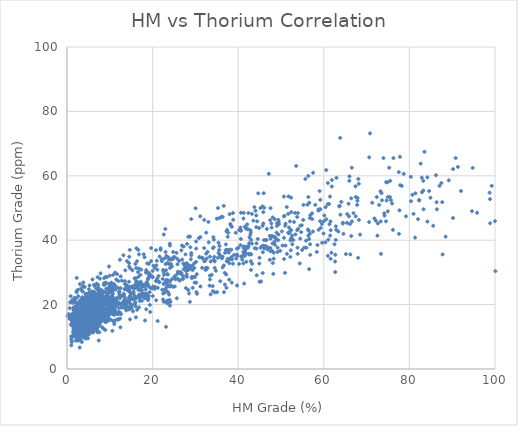
| Category | Series 0 |
|---|---|
| 5.443047224 | 18.534 |
| 2.898147194 | 12.831 |
| 1.411529032 | 17.108 |
| 7.118693742 | 17.108 |
| 9.540768168 | 24.95 |
| 59.60143324 | 39.207 |
| 44.99017923 | 27.088 |
| 17.22734157 | 27.088 |
| nan | 29.94 |
| nan | 34.93 |
| 1.644251991 | 21.386 |
| 5.271050762 | 20.673 |
| 2.274062136 | 24.237 |
| 21.63733876 | 34.93 |
| 41.54231609 | 44.197 |
| 3.07612922 | 17.108 |
| 15.50318212 | 25.663 |
| 9.811186497 | 26.376 |
| 46.68665275 | 43.484 |
| 3.796539203 | 17.108 |
| 4.842013208 | 20.531 |
| 36.05757259 | 47.221 |
| 51.06817726 | 38.324 |
| 40.94105243 | 34.903 |
| 4.273843238 | 17.109 |
| 4.148194291 | 17.109 |
| 63.88212248 | 47.906 |
| 1.247108864 | 15.683 |
| 0.534299388 | 15.683 |
| 18.01900011 | 25.663 |
| 30.80949927 | 40.633 |
| nan | 47.761 |
| 41.28483305 | 48.474 |
| 32.82107337 | 31.366 |
| 8.660848991 | 17.108 |
| 38.83294263 | 46.336 |
| 3.324656386 | 9.98 |
| 1.871702953 | 19.247 |
| nan | 52.751 |
| nan | 33.504 |
| 3.547087353 | 19.247 |
| 2.218481889 | 15.683 |
| 1.515212356 | 14.257 |
| 7.060243335 | 12.119 |
| 11.2421479 | 29.94 |
| nan | 37.781 |
| 24.81294867 | 36.356 |
| 42.09048786 | 44.91 |
| 35.40345185 | 39.207 |
| 6.826329512 | 24.95 |
| 3.224686492 | 24.95 |
| 3.002171558 | 16.396 |
| 3.489379962 | 19.247 |
| 5.22696755 | 19.96 |
| 5.967452877 | 23.524 |
| 6.566618421 | 19.247 |
| nan | 37.068 |
| nan | 39.92 |
| 23.0244987 | 36.356 |
| 14.49130811 | 27.088 |
| 9.339041697 | 28.514 |
| 4.513258618 | 18.534 |
| 5.718179758 | 13.687 |
| 5.739538427 | 14.372 |
| 6.737158139 | 19.162 |
| 8.713448789 | 26.69 |
| 10.58965724 | 24.637 |
| 15.96841779 | 28.059 |
| 9.531069121 | 23.268 |
| 16.58429999 | 30.112 |
| 7.694521282 | 18.478 |
| 4.832027876 | 19.847 |
| 3.648580805 | 14.372 |
| 14.55380195 | 24.637 |
| 10.90348627 | 20.716 |
| 22.46570435 | 30.76 |
| 5.190229579 | 21.971 |
| 13.53195368 | 26.366 |
| 30.14882092 | 33.271 |
| 57.25847846 | 48.337 |
| 34.32783716 | 40.176 |
| 66.57595837 | 45.826 |
| 68.01805269 | 34.526 |
| 2.254602295 | 23.855 |
| 4.752360783 | 20.716 |
| 3.020128774 | 26.366 |
| 5.500807244 | 21.971 |
| 22.57625526 | 30.132 |
| 65.47347866 | 48.106 |
| 2.218819858 | 17.269 |
| 3.206383645 | 19.736 |
| 22.46995645 | 23.436 |
| nan | 42.555 |
| 62.79817115 | 40.088 |
| 47.48591204 | 37.621 |
| 89.20198834 | 58.591 |
| 52.41935705 | 48.723 |
| nan | 49.956 |
| 47.5454376 | 49.956 |
| 26.04125321 | 27.754 |
| 4.934615617 | 16.035 |
| 4.293739836 | 16.652 |
| 4.157938086 | 16.652 |
| 2.518863823 | 15.419 |
| 3.870010558 | 19.736 |
| nan | 14.265 |
| 2.213968285 | 12.125 |
| 2.644966465 | 18.544 |
| 3.529642335 | 19.257 |
| nan | 15.691 |
| 4.316635014 | 20.684 |
| 4.401479136 | 17.118 |
| 6.994553412 | 22.823 |
| 3.949466186 | 19.97 |
| 2.586025973 | 15.691 |
| 3.130321805 | 19.97 |
| 3.073301532 | 14.265 |
| 10.77252649 | 29.242 |
| 11.50014101 | 20.684 |
| 2.04686753 | 17.118 |
| 4.378042938 | 13.551 |
| 4.225699195 | 14.265 |
| 4.124676839 | 9.985 |
| 11.41055365 | 25.676 |
| 10.57167759 | 24.25 |
| 11.67603989 | 22.11 |
| 8.324439788 | 19.257 |
| 9.48560322 | 19.97 |
| 7.40520238 | 23.537 |
| 15.28689974 | 30.669 |
| 58.74040314 | 49.187 |
| 2.118936697 | 12.791 |
| 3.772650814 | 10.098 |
| 3.631922108 | 12.791 |
| 4.388957782 | 10.098 |
| 5.963945758 | 27.801 |
| 11.50661699 | 27.801 |
| 22.97577546 | 43.484 |
| 19.99346534 | 28.514 |
| 3.604970711 | 14.438 |
| 2.512168511 | 18.833 |
| 3.078537477 | 16.949 |
| 7.265708773 | 24.482 |
| 9.948949689 | 25.738 |
| nan | 48.337 |
| 56.83499343 | 47.709 |
| nan | 37.621 |
| 60.93639638 | 57.753 |
| 2.636572952 | 22.599 |
| 3.928756567 | 21.344 |
| 1.63217215 | 15.694 |
| 56.38469391 | 41.432 |
| 0.747194042 | 20.716 |
| 61.32249476 | 44.964 |
| 49.21569586 | 37.69 |
| 67.86079263 | 52.238 |
| 9.051094224 | 16.69 |
| 6.600237668 | 17.882 |
| nan | 33.379 |
| 53.88841781 | 35.764 |
| 30.1952064 | 26.823 |
| 24.09634954 | 25.631 |
| 19.96377227 | 25.034 |
| 23.10817276 | 20.862 |
| 24.17308071 | 20.862 |
| 2.470060139 | 10.729 |
| nan | 47.906 |
| 74.53040548 | 45.852 |
| 66.20413908 | 35.587 |
| 23.27898553 | 27.375 |
| nan | 45.168 |
| 52.09785037 | 45.852 |
| 18.47192576 | 22.054 |
| 10.36526639 | 17.286 |
| 15.8432607 | 20.266 |
| 25.19030992 | 25.631 |
| 27.13030777 | 28.015 |
| 15.42360446 | 17.882 |
| 14.54328252 | 18.478 |
| 29.82374204 | 26.823 |
| 9.209258744 | 17.192 |
| 10.75279903 | 25.127 |
| 31.72742031 | 34.384 |
| 42.54810327 | 35.707 |
| 5.359891562 | 23.804 |
| 55.20536267 | 46.286 |
| 44.90184872 | 43.773 |
| 8.587962292 | 18.571 |
| 2.657645197 | 17.577 |
| nan | 14.438 |
| 4.564191864 | 22.55 |
| nan | 40.772 |
| 49.05071186 | 44.437 |
| 40.53475224 | 38.467 |
| nan | 12.964 |
| 19.19581993 | 29.182 |
| nan | 13.646 |
| 6.541386533 | 18.571 |
| 7.732274182 | 23.876 |
| 11.38806811 | 17.244 |
| 37.67633772 | 42.319 |
| 44.27931575 | 39.013 |
| 86.20926226 | 60.172 |
| 32.83456802 | 36.368 |
| 27.76248162 | 25.127 |
| 17.47696483 | 21.16 |
| 35.0760916 | 23.855 |
| 46.94409682 | 37.665 |
| 9.558607248 | 22.599 |
| 8.7383345 | 17.577 |
| 18.07907641 | 21.971 |
| 42.99311538 | 30.76 |
| 24.06681225 | 31.388 |
| 25.76236319 | 29.504 |
| 51.86201668 | 43.943 |
| 2.626646785 | 13.811 |
| 9.971381773 | 23.855 |
| 86.42811251 | 49.593 |
| 44.31840022 | 29.094 |
| 44.98402703 | 34.526 |
| 6.974977177 | 14.438 |
| 7.286500008 | 13.811 |
| 10.52144731 | 18.205 |
| 6.892345011 | 16.949 |
| 18.95973983 | 21.344 |
| nan | 45.826 |
| 74.96298919 | 48.965 |
| 68.07915688 | 59.009 |
| nan | 35.771 |
| 7.304337797 | 17.577 |
| 15.11880843 | 18.833 |
| 53.86610557 | 37.665 |
| 7.209928576 | 16.309 |
| 7.861495006 | 19.706 |
| 9.744009094 | 24.463 |
| 9.925930224 | 17.668 |
| 67.78977035 | 50.965 |
| 11.22818339 | 18.347 |
| 33.79677817 | 29.22 |
| 82.26876285 | 52.324 |
| 66.39929259 | 53.003 |
| 15.97056225 | 32.617 |
| 16.74082201 | 22.482 |
| nan | 39.013 |
| 56.50153504 | 42.98 |
| 48.97277126 | 42.319 |
| 87.03867004 | 56.866 |
| 18.66427166 | 22.599 |
| 5.617350973 | 16.949 |
| 34.24043232 | 33.899 |
| 40.20486584 | 32.643 |
| 47.74963251 | 45.198 |
| 73.47016842 | 54.614 |
| 37.91574965 | 37.037 |
| 10.41199608 | 23.855 |
| 12.04817835 | 25.11 |
| 12.35118418 | 17.577 |
| 8.684814673 | 18.833 |
| 12.08018341 | 20.088 |
| 7.378509952 | 24.482 |
| 16.02268744 | 19.46 |
| 11.13641601 | 18.205 |
| 10.88113663 | 20.088 |
| 41.54608048 | 35.154 |
| 31.57726296 | 34.526 |
| 35.20987797 | 34.526 |
| 9.660513342 | 20.716 |
| nan | 19.119 |
| 7.552936592 | 17.577 |
| 63.39598303 | 42.687 |
| 61.04256728 | 40.176 |
| 12.32168769 | 21.971 |
| 18.28006195 | 22.599 |
| 20.82940643 | 21.344 |
| 80.37901522 | 52.103 |
| 56.2939619 | 43.315 |
| 38.39457073 | 37.037 |
| 13.84091747 | 18.205 |
| 1.907687032 | 18.205 |
| 74.12546706 | 48.337 |
| 78.22101385 | 56.866 |
| 62.81224472 | 44.303 |
| 70.58788687 | 45.625 |
| 4.301753664 | 18.205 |
| 18.62849839 | 26.993 |
| 61.57323972 | 45.826 |
| 5.951750033 | 16.322 |
| 12.5091618 | 25.11 |
| 3.741001253 | 25.738 |
| 1.974556852 | 19.46 |
| 6.756083648 | 20.716 |
| nan | 42.059 |
| 4.499095777 | 18.205 |
| 6.126155509 | 18.833 |
| 6.444062344 | 25.738 |
| nan | 28.987 |
| 16.68815277 | 22.517 |
| 12.39667582 | 15.693 |
| 10.91288187 | 24.564 |
| 9.003299683 | 21.834 |
| nan | 28.658 |
| nan | 29.34 |
| 17.13856213 | 24.564 |
| 29.68964647 | 32.751 |
| 49.46514771 | 45.716 |
| 48.05673723 | 47.08 |
| 19.32332798 | 23.881 |
| 5.013634518 | 21.834 |
| 23.11579066 | 27.532 |
| 32.55499102 | 30.89 |
| 6.435999361 | 23.503 |
| 5.778260539 | 18.131 |
| 12.16791576 | 20.47 |
| 11.06462425 | 19.105 |
| 20.90135801 | 27.293 |
| 4.611386676 | 10.917 |
| nan | 36.163 |
| nan | 27.975 |
| 34.50639648 | 31.387 |
| 76.27767337 | 65.503 |
| 59.18199166 | 52.539 |
| 39.43710782 | 42.304 |
| 7.180746762 | 12.964 |
| 8.686496456 | 21.834 |
| 7.371761844 | 19.787 |
| 62.96263052 | 59.362 |
| 8.289859115 | 17.74 |
| 6.620193159 | 17.058 |
| 4.028450133 | 10.917 |
| 2.81804257 | 14.329 |
| 17.31041372 | 23.199 |
| 27.98718348 | 29.34 |
| 90.21245952 | 62.091 |
| 37.19387102 | 29.34 |
| 11.18525513 | 19.787 |
| 15.18725936 | 19.787 |
| 13.74310011 | 20.47 |
| 37.79659225 | 36.163 |
| 26.68893193 | 29.803 |
| 100.0955489 | 30.399 |
| 4.140632706 | 14.901 |
| 4.933060368 | 13.113 |
| 7.818472265 | 15.498 |
| 10.49273586 | 17.286 |
| 40.94900185 | 33.975 |
| 36.89243657 | 26.227 |
| nan | 36.956 |
| 6.908536012 | 16.69 |
| 11.28271998 | 20.47 |
| 9.166077094 | 22.517 |
| 13.52230075 | 27.293 |
| nan | 35.764 |
| 14.66590336 | 22.517 |
| 3.349285406 | 13.687 |
| 7.061397423 | 15.74 |
| 54.9385708 | 36.956 |
| 5.740323159 | 13.003 |
| 40.60835697 | 43.115 |
| 4.009649318 | 13.687 |
| 125.1375857 | 33.534 |
| 37.54079611 | 41.062 |
| 9.410763915 | 19.162 |
| 8.349390417 | 16.69 |
| 7.58763618 | 14.901 |
| 20.87598484 | 32.187 |
| nan | 28.611 |
| nan | 28.658 |
| 17.50739399 | 24.438 |
| 82.63559169 | 63.778 |
| 99.99320538 | 45.897 |
| 25.85898365 | 28.015 |
| 4.744737868 | 16.69 |
| 3.497412241 | 11.921 |
| 60.37629177 | 39.34 |
| 4.744240358 | 10.729 |
| 94.78291522 | 62.451 |
| 25.88634092 | 30.218 |
| 41.79253174 | 43.649 |
| 24.77804064 | 25.518 |
| nan | 71.181 |
| 94.61868344 | 49.021 |
| 73.6044792 | 52.378 |
| 16.83089371 | 26.189 |
| nan | 71.181 |
| 34.19905317 | 40.939 |
| 14.48680091 | 24.564 |
| 73.93968564 | 65.503 |
| 29.21286121 | 32.069 |
| 6.581740626 | 17.74 |
| 74.90601474 | 57.997 |
| 45.68580968 | 50.492 |
| 59.54525613 | 45.033 |
| 3.457902688 | 17.74 |
| 6.693586417 | 20.47 |
| 6.460701189 | 18.423 |
| 13.98488291 | 24.564 |
| 27.98467098 | 28.611 |
| 27.81947856 | 30.399 |
| 8.491616877 | 17.882 |
| 9.011364945 | 16.69 |
| 23.96932967 | 21.458 |
| 27.0208188 | 28.015 |
| 29.14892829 | 28.611 |
| 60.58897931 | 46.493 |
| 61.24038497 | 51.261 |
| 52.19259097 | 39.936 |
| 60.01088245 | 45.897 |
| 12.22812312 | 23.104 |
| 24.27016238 | 32.617 |
| 71.30997238 | 51.644 |
| 29.49081131 | 28.54 |
| 8.176388035 | 23.104 |
| 75.5161216 | 58.439 |
| 18.476419 | 29.899 |
| 7.701432065 | 18.347 |
| nan | 61.837 |
| 8.205211271 | 19.706 |
| nan | 56.401 |
| 56.73310988 | 46.887 |
| 43.01548301 | 40.092 |
| 13.56657755 | 19.027 |
| 43.7911208 | 50.285 |
| 6.584719715 | 17.668 |
| 8.956260686 | 21.065 |
| 23.72089552 | 34.656 |
| 50.80827315 | 47.567 |
| 77.51101957 | 61.158 |
| 77.85797087 | 57.08 |
| 52.57396334 | 41.451 |
| nan | 37.374 |
| nan | 42.131 |
| 6.964355382 | 26.502 |
| 3.80536363 | 17.668 |
| 87.46975757 | 57.76 |
| 5.813860233 | 15.629 |
| 9.034917561 | 16.988 |
| 53.99402796 | 43.49 |
| 2.371266535 | 12.911 |
| 8.815088603 | 21.745 |
| 6.021705071 | 19.706 |
| 8.490479635 | 19.706 |
| 23.85492821 | 23.104 |
| 52.17921462 | 42.81 |
| 55.25767817 | 50.965 |
| 65.96518034 | 58.439 |
| 35.97719788 | 34.656 |
| 8.4271363 | 18.347 |
| 3.392760865 | 19.706 |
| 29.02933751 | 35.335 |
| 2.56492727 | 12.232 |
| 6.751999188 | 22.424 |
| 3.336504095 | 17.668 |
| 25.3102265 | 27.861 |
| 39.71097268 | 37.374 |
| 29.04716439 | 36.015 |
| 6.266189927 | 14.95 |
| 5.288031688 | 18.347 |
| nan | 21.065 |
| nan | 18.347 |
| 7.158774295 | 23.104 |
| 4.838598798 | 15.693 |
| 3.205834065 | 17.74 |
| 29.73188239 | 31.387 |
| 9.019389374 | 18.423 |
| 8.285547197 | 17.74 |
| 3.935916203 | 12.964 |
| 5.124015545 | 13.646 |
| 3.650794847 | 12.282 |
| 3.205834065 | 17.74 |
| 36.38136968 | 31.561 |
| 34.07365107 | 24.175 |
| 8.504607936 | 20.145 |
| 18.07838421 | 26.189 |
| 9.816177126 | 18.802 |
| 60.58111449 | 61.779 |
| 43.21339301 | 38.948 |
| 25.76104901 | 34.247 |
| 3.438650924 | 14.773 |
| 5.798948297 | 20.47 |
| 9.070520659 | 20.47 |
| 6.045758152 | 17.74 |
| 10.36537683 | 22.517 |
| 6.383316989 | 22.517 |
| 5.864238809 | 23.199 |
| 4.045108855 | 18.423 |
| 3.608011906 | 15.011 |
| 2.281187627 | 14.329 |
| 6.154413356 | 22.517 |
| 4.019608152 | 15.693 |
| 3.009282847 | 12.964 |
| 1.947215195 | 18.423 |
| 3.553913811 | 16.376 |
| 5.384464771 | 19.787 |
| 7.947543612 | 21.152 |
| 7.939908715 | 21.834 |
| 6.311523295 | 17.74 |
| 8.046750503 | 15.011 |
| 2.691976586 | 12.838 |
| 9.153282618 | 24.963 |
| 4.315718047 | 12.838 |
| nan | 13.551 |
| nan | 14.265 |
| 5.362597905 | 22.823 |
| 3.840028302 | 15.691 |
| 2.52135518 | 16.404 |
| 2.890338612 | 12.125 |
| 6.493974302 | 18.131 |
| 7.098609824 | 19.474 |
| 5.630653873 | 15.445 |
| 14.45473464 | 24.175 |
| 5.474909423 | 19.474 |
| 7.73302592 | 20.817 |
| 2.583740706 | 14.624 |
| 7.048130958 | 17.549 |
| 4.534695892 | 19.011 |
| 3.230521748 | 16.086 |
| 6.476603185 | 22.667 |
| 7.190157682 | 16.086 |
| 9.067210064 | 22.667 |
| 6.997003252 | 18.28 |
| nan | 19.742 |
| 6.886227876 | 19.742 |
| 7.689834103 | 19.011 |
| 4.933424688 | 20.474 |
| 4.132779242 | 19.011 |
| 3.034817333 | 15.355 |
| 7.876767333 | 21.205 |
| nan | 20.101 |
| 7.990516756 | 21.205 |
| 8.809748732 | 16.086 |
| 4.685397935 | 18.28 |
| 2.898437992 | 15.355 |
| 4.250845041 | 15.355 |
| 22.9808763 | 24.861 |
| 2.534296412 | 14.624 |
| 13.04362749 | 22.667 |
| 15.26384993 | 25.592 |
| 5.628337794 | 18.28 |
| 36.22326242 | 34.366 |
| 4.081668741 | 19.742 |
| 5.044370226 | 20.474 |
| 4.906597512 | 21.936 |
| 48.62573614 | 40.947 |
| 2.648800352 | 16.818 |
| 1.974480173 | 14.634 |
| 29.89991117 | 28.572 |
| 9.790361361 | 15.331 |
| nan | 13.937 |
| nan | 18.119 |
| 12.01191733 | 15.331 |
| 23.14678018 | 30.662 |
| 27.77109186 | 32.753 |
| 10.6100082 | 11.847 |
| 10.522736 | 18.816 |
| 5.702067523 | 14.634 |
| 4.051216127 | 13.241 |
| 7.371621039 | 17.422 |
| 9.417595412 | 23.694 |
| 10.50746881 | 23.694 |
| 14.01316098 | 20.906 |
| 11.33838278 | 19.512 |
| 7.341835474 | 17.422 |
| 7.625999256 | 18.119 |
| 15.43247946 | 21.603 |
| 7.922837371 | 20.209 |
| nan | 24.391 |
| nan | 28.628 |
| 6.901324445 | 20.209 |
| 11.06706723 | 13.937 |
| 3.464960188 | 8.362 |
| 3.138474026 | 9.059 |
| nan | 27.41 |
| 5.594946727 | 16.818 |
| 6.208176318 | 23.398 |
| 2.43528888 | 17.549 |
| 2.557189145 | 19.011 |
| 8.91311123 | 14.624 |
| nan | 21.928 |
| 3.7634523 | 20.474 |
| 10.38099701 | 19.011 |
| 16.10779948 | 26.323 |
| 17.48979857 | 25.592 |
| 7.147515815 | 28.517 |
| 6.926947744 | 21.936 |
| 7.920654265 | 23.398 |
| 19.14650131 | 32.687 |
| nan | 35.771 |
| 4.655045648 | 17.886 |
| 3.761690989 | 17.886 |
| 5.726881768 | 14.802 |
| 7.12265625 | 17.269 |
| 4.434432992 | 17.269 |
| 17.34297143 | 30.837 |
| 23.21795072 | 35.154 |
| nan | 33.304 |
| 3.867563653 | 16.035 |
| 10.49087835 | 22.203 |
| 3.831563647 | 11.718 |
| 3.263633091 | 16.035 |
| 35.61435965 | 46.873 |
| 1.981400405 | 16.035 |
| 2.447680859 | 14.802 |
| 6.442980088 | 14.802 |
| 16.65606845 | 37.005 |
| 10.59944125 | 23.436 |
| 22.64399767 | 29.269 |
| 4.460169195 | 11.15 |
| 22.43013776 | 21.603 |
| 28.74685476 | 41.115 |
| nan | 50.175 |
| 35.00547538 | 46.69 |
| 47.14770358 | 60.628 |
| nan | 32.283 |
| 16.35422619 | 33.45 |
| 5.790200177 | 14.634 |
| 7.512374838 | 18.816 |
| 14.79281432 | 23.694 |
| 13.3139438 | 22.997 |
| 16.6250515 | 28.572 |
| nan | 46.292 |
| 3.066733768 | 11.847 |
| 63.83815283 | 71.778 |
| 7.619023059 | 16.725 |
| 7.031138462 | 18.816 |
| 14.540962 | 34.844 |
| 70.80561576 | 73.172 |
| 37.99442353 | 48.084 |
| 45.89802936 | 38.328 |
| 45.34525323 | 27.178 |
| 3.288270297 | 13.937 |
| 7.304120712 | 19.512 |
| nan | 45.263 |
| 8.795340179 | 26.168 |
| 5.853178438 | 24.046 |
| 4.333500865 | 21.924 |
| 21.8801361 | 37.484 |
| 24.02310748 | 38.898 |
| 6.307080648 | 26.168 |
| 100.6714174 | 39.605 |
| 25.81821413 | 32.533 |
| 16.22883609 | 37.484 |
| 24.10911127 | 33.948 |
| nan | 43.142 |
| 6.112212206 | 22.632 |
| 2.185803133 | 16.974 |
| 4.347014458 | 19.119 |
| 3.938139712 | 15.419 |
| 1.983918567 | 12.335 |
| 5.167246127 | 18.502 |
| 14.71360914 | 15.419 |
| 3.794224662 | 17.269 |
| nan | 62.291 |
| 14.54152057 | 19.119 |
| 1.08518423 | 8.634 |
| 1.851036018 | 17.886 |
| 12.4804887 | 12.952 |
| 5.668682267 | 16.035 |
| 38.1610018 | 45.022 |
| 65.99748309 | 59.824 |
| 86.35878553 | 51.807 |
| 37.88530842 | 27.754 |
| nan | 45.022 |
| 73.35703613 | 35.771 |
| 11.79428935 | 15.419 |
| 16.11017155 | 16.035 |
| 16.82854825 | 19.119 |
| 7.450628432 | 14.137 |
| nan | 60.587 |
| 3.658486424 | 14.81 |
| 3.973300748 | 14.137 |
| 5.955135108 | 14.137 |
| 9.483724744 | 21.542 |
| 78.66533034 | 60.587 |
| 73.2576057 | 55.202 |
| 2.841847408 | 16.157 |
| 23.23557802 | 24.235 |
| 28.34305855 | 41.065 |
| 28.08422101 | 32.313 |
| 4.4544808 | 15.483 |
| 3.392969729 | 10.771 |
| 2.706739374 | 14.137 |
| 5.862468153 | 13.464 |
| 21.86729862 | 37.025 |
| 22.83295887 | 34.333 |
| 19.14615947 | 25.581 |
| 6.601654503 | 17.503 |
| 8.515927233 | 12.517 |
| 10.49007903 | 19.67 |
| 41.19757916 | 32.783 |
| 27.24625845 | 30.995 |
| nan | 10.729 |
| 1.116544561 | 8.345 |
| 39.83027584 | 35.167 |
| 48.03521763 | 39.009 |
| 63.7087012 | 50.643 |
| 62.67487192 | 30.112 |
| 22.2520483 | 24.637 |
| 23.41558036 | 21.215 |
| 23.13453738 | 13.113 |
| 21.17495544 | 14.901 |
| 56.55485255 | 30.995 |
| 38.50321147 | 26.823 |
| 10.9869251 | 14.901 |
| 8.32156275 | 16.094 |
| 62.6304357 | 33.379 |
| 51.39312542 | 35.764 |
| 44.44374365 | 45.852 |
| 65.79098113 | 51.327 |
| 61.59038581 | 34.218 |
| 2.853149094 | 13.709 |
| 6.439972997 | 16.094 |
| 9.251535798 | 17.286 |
| 22.9269721 | 23.842 |
| 6.882514692 | 19.67 |
| 5.242641329 | 17.286 |
| 4.095279106 | 10.729 |
| 2.881064277 | 15.498 |
| nan | 10.133 |
| 14.17712281 | 19.162 |
| 22.77105636 | 26.69 |
| 10.2633553 | 19.847 |
| 7.799174211 | 18.571 |
| 2.240517164 | 10.612 |
| nan | 17.907 |
| 2.494621291 | 16.581 |
| 28.83775523 | 31.172 |
| 32.5227188 | 35.815 |
| 6.869562745 | 21.223 |
| 6.686322891 | 14.591 |
| 6.169303832 | 19.897 |
| 3.305993745 | 15.918 |
| 33.32449874 | 25.866 |
| 50.35501355 | 38.324 |
| 14.83815454 | 21.9 |
| 36.36900288 | 34.903 |
| 7.295404048 | 25.321 |
| 48.19109506 | 41.12 |
| 2.114492182 | 11.275 |
| 1.00730572 | 9.285 |
| nan | 26.52 |
| 29.36924472 | 25.203 |
| 34.78319284 | 30.509 |
| 28.3425957 | 24.54 |
| 2.72228315 | 15.254 |
| 24.07685074 | 27.193 |
| 45.75010053 | 36.271 |
| nan | 45.168 |
| nan | 36.956 |
| 61.61403204 | 43.115 |
| 48.52369645 | 46.537 |
| 1.488068135 | 13.928 |
| 52.32909483 | 40.457 |
| 7.907779767 | 15.918 |
| 8.209041403 | 15.254 |
| 66.95114901 | 48.416 |
| 19.3694426 | 19.897 |
| 2.605308732 | 15.918 |
| 34.28864374 | 37.804 |
| 53.78455241 | 43.115 |
| 85.56198821 | 44.484 |
| 17.43396589 | 22.55 |
| 23.44769031 | 26.529 |
| 17.51990023 | 23.213 |
| 0.969707477 | 16.581 |
| 53.36885575 | 41.784 |
| 41.38970356 | 26.529 |
| 24.46977617 | 27.856 |
| 14.5048554 | 21.887 |
| nan | 21.887 |
| 2.576569335 | 14.591 |
| 56.5676592 | 40.378 |
| 40.04742754 | 37.64 |
| 37.09377622 | 36.956 |
| 14.93761639 | 19.847 |
| 3.498203156 | 15.066 |
| 10.42419542 | 19.46 |
| 18.5436748 | 23.227 |
| 41.69870604 | 37.037 |
| 21.39496343 | 28.877 |
| 4.171026283 | 10.672 |
| 2.752278627 | 16.322 |
| 7.996403359 | 16.949 |
| 10.52765288 | 20.088 |
| 10.07616159 | 20.088 |
| nan | 16.322 |
| nan | 31.481 |
| nan | 28.743 |
| 22.89142215 | 23.953 |
| 27.49758565 | 32.165 |
| 26.4526828 | 30.112 |
| 3.420015185 | 16.949 |
| 10.54753798 | 22.599 |
| 5.173066473 | 17.577 |
| nan | 34.538 |
| 45.2292576 | 37.665 |
| 9.239040658 | 16.949 |
| 2.122799024 | 13.183 |
| 42.25103442 | 37.665 |
| 9.802632968 | 19.46 |
| 34.02604317 | 25.738 |
| 48.85961759 | 40.378 |
| 43.00628627 | 35.587 |
| 15.82189952 | 25.11 |
| 10.0461277 | 18.833 |
| 10.14369702 | 18.833 |
| 60.94626863 | 35.154 |
| 22.55493891 | 26.366 |
| 8.803733867 | 20.088 |
| 19.57618581 | 25.11 |
| 72.63150914 | 45.198 |
| 77.6743733 | 49.274 |
| 37.92880682 | 32.85 |
| 10.84628093 | 16.949 |
| 9.813501358 | 21.971 |
| nan | 21.586 |
| 8.904976995 | 17.577 |
| 18.99703264 | 21.971 |
| 61.47724503 | 41.432 |
| nan | 41.432 |
| 57.47545223 | 42.687 |
| 30.25699 | 23.855 |
| 47.38651588 | 33.899 |
| 10.62547958 | 17.577 |
| 9.852905164 | 18.833 |
| 7.569472536 | 13.811 |
| 6.200144511 | 23.855 |
| 9.556163877 | 18.205 |
| 48.50707772 | 39.548 |
| 81.32454029 | 40.804 |
| 73.29885153 | 45.826 |
| 15.58592776 | 25.11 |
| 8.582767955 | 16.949 |
| 11.19741933 | 15.066 |
| 59.29841535 | 43.799 |
| 2.561350903 | 17.793 |
| 2.980567635 | 17.793 |
| 14.46577807 | 25.321 |
| 82.00296087 | 46.537 |
| 2.53353465 | 13.003 |
| 6.938470779 | 20.531 |
| 7.690847317 | 28.059 |
| 12.1049882 | 17.109 |
| nan | 47.004 |
| 84.21219547 | 45.783 |
| 26.38978712 | 27.47 |
| 17.33677617 | 26.249 |
| 5.623360655 | 12.819 |
| 54.72699353 | 42.511 |
| 9.110288947 | 21.964 |
| 5.221916014 | 13.43 |
| 23.48374641 | 27.632 |
| 9.181604735 | 17.005 |
| 8.0994516 | 14.879 |
| 6.301380967 | 20.547 |
| 58.78547246 | 43.22 |
| 52.34039707 | 43.22 |
| 40.52285489 | 43.928 |
| 8.578795217 | 17.005 |
| 5.574736482 | 14.17 |
| 8.934029648 | 18.422 |
| 4.054942829 | 17.713 |
| 3.874699744 | 14.879 |
| 7.263212138 | 19.839 |
| 24.52410692 | 31.883 |
| 54.85102203 | 44.637 |
| 77.78946887 | 65.892 |
| 51.34150094 | 50.305 |
| 23.78148305 | 32.592 |
| 4.054179373 | 15.587 |
| 9.37606558 | 16.296 |
| 62.9261203 | 43.22 |
| 84.61150141 | 55.265 |
| 53.54851492 | 63.058 |
| 37.42142224 | 43.22 |
| 5.479660448 | 19.13 |
| 5.92520658 | 21.16 |
| 4.27152563 | 17.853 |
| 9.284862173 | 17.853 |
| 1.842656277 | 14.547 |
| 2.535784355 | 17.853 |
| 7.116092865 | 21.821 |
| 7.664843844 | 17.192 |
| 34.51440786 | 23.804 |
| 99.23275208 | 56.866 |
| 100.8638665 | 66.785 |
| 61.45431599 | 53.56 |
| 5.250862021 | 25.928 |
| 6.780534153 | 21.152 |
| 90.80689276 | 65.503 |
| 6.323031164 | 23.881 |
| nan | 23.146 |
| nan | 23.146 |
| 7.104914111 | 20.47 |
| 107.7447948 | 44.351 |
| 63.59963236 | 50.492 |
| 44.92898498 | 32.751 |
| 39.73134563 | 25.928 |
| 16.70855759 | 24.564 |
| 16.24390664 | 26.611 |
| 5.12576437 | 15.693 |
| 2.56065635 | 13.225 |
| 66.12520734 | 45.033 |
| 52.30336544 | 36.845 |
| 61.88300924 | 58.68 |
| 53.93903623 | 48.445 |
| nan | 51.857 |
| nan | 55.95 |
| 22.35607166 | 27.975 |
| 5.979869186 | 17.74 |
| 10.28700597 | 19.176 |
| 10.94958834 | 21.16 |
| 13.90513387 | 25.928 |
| 6.668061585 | 21.834 |
| 10.35669209 | 19.787 |
| 14.29717957 | 21.16 |
| 82.93210643 | 54.883 |
| 9.558070564 | 19.176 |
| 4.811329314 | 15.87 |
| 21.50703452 | 27.111 |
| 28.19585491 | 31.078 |
| 60.41603478 | 50.254 |
| 50.68599938 | 53.56 |
| 83.51806845 | 67.446 |
| 3.364856647 | 18.515 |
| 8.135169962 | 21.488 |
| 9.500881861 | 15.445 |
| 60.12083282 | 47.678 |
| 49.53391838 | 44.992 |
| 8.140750208 | 20.145 |
| 26.19985871 | 33.576 |
| 41.26635207 | 37.605 |
| 42.38424882 | 48.445 |
| 5.497537568 | 21.834 |
| 9.831801771 | 21.152 |
| 17.00359782 | 21.152 |
| 12.09720445 | 23.881 |
| 24.43679591 | 34.116 |
| 41.9281394 | 43.669 |
| 6.675263642 | 22.517 |
| 5.893281827 | 23.881 |
| 38.78217356 | 48.445 |
| 44.04774717 | 49.127 |
| nan | 49.127 |
| nan | 57.997 |
| 53.31018507 | 48.445 |
| 18.60330466 | 26.611 |
| 31.14692571 | 40.962 |
| 44.21061212 | 47.678 |
| 56.20204291 | 51.035 |
| 49.38926899 | 46.335 |
| 7.306377432 | 22.16 |
| 5.073084927 | 19.474 |
| 35.64435453 | 38.21 |
| 62.69448072 | 35.481 |
| 3.515944047 | 21.152 |
| 6.785477674 | 13.646 |
| 45.9542326 | 54.586 |
| 74.54768877 | 57.997 |
| 15.29147557 | 25.246 |
| 14.29268599 | 24.564 |
| 9.472846124 | 19.787 |
| 52.34829638 | 53.221 |
| 27.16760903 | 32.751 |
| 32.48012261 | 31.387 |
| 2.908718718 | 18.423 |
| 9.765446741 | 19.105 |
| 8.198457559 | 12.964 |
| 34.54136555 | 33.434 |
| 60.90766112 | 51.174 |
| 92.05124578 | 55.268 |
| 16.19349791 | 27.293 |
| 20.52347972 | 31.387 |
| 7.666077591 | 19.787 |
| 7.790433235 | 22.517 |
| 43.85965747 | 37.528 |
| 2.121438148 | 16.309 |
| 41.95250283 | 38.054 |
| 56.61733454 | 51.644 |
| 72.94670909 | 50.965 |
| 58.80404639 | 49.606 |
| nan | 37.38 |
| nan | 47.873 |
| 59.21911554 | 49.606 |
| 23.46868655 | 20.386 |
| 12.69785341 | 20.386 |
| 13.41023609 | 19.027 |
| 44.26542697 | 37.374 |
| 3.650430314 | 17.668 |
| 2.631014206 | 16.309 |
| 11.0971105 | 19.706 |
| 6.477896164 | 17.668 |
| 15.72604281 | 21.745 |
| 10.17161376 | 25.143 |
| 8.26509027 | 15.629 |
| 14.76350008 | 31.258 |
| 21.06239922 | 28.059 |
| nan | 28.743 |
| 5.822448452 | 18.478 |
| 4.59744995 | 15.056 |
| 4.21833403 | 15.056 |
| 2.768208 | 16.425 |
| nan | 32.165 |
| 37.53988284 | 34.218 |
| 7.816998788 | 24.637 |
| 8.225184356 | 19.847 |
| 2.922516685 | 17.793 |
| 6.621255079 | 13.687 |
| 33.41443767 | 34.903 |
| 3.855933562 | 18.882 |
| 5.159057652 | 20.101 |
| 3.480223102 | 24.364 |
| 3.400176879 | 21.928 |
| 8.573003064 | 26.192 |
| 16.76575723 | 26.801 |
| 5.723269505 | 20.71 |
| 1.716575058 | 21.319 |
| nan | 16.446 |
| nan | 15.837 |
| 2.667853779 | 15.837 |
| 1.508645903 | 18.273 |
| 47.57035294 | 36.546 |
| 8.223577276 | 24.364 |
| 1.544805803 | 18.882 |
| 5.112674527 | 21.928 |
| 3.942843624 | 25.582 |
| 6.863722936 | 21.928 |
| 9.046646277 | 28.628 |
| nan | 25.582 |
| nan | 28.019 |
| 5.949880406 | 21.928 |
| 1.604497873 | 17.055 |
| 1.177705759 | 16.446 |
| 0.769383039 | 16.446 |
| 8.920376639 | 21.319 |
| 13.82074741 | 26.192 |
| 9.113537511 | 26.801 |
| 4.428970548 | 22.537 |
| 8.4979172 | 23.755 |
| nan | 12.182 |
| 4.291454882 | 20.71 |
| 0.632824792 | 18.882 |
| 2.097830445 | 17.664 |
| 5.961939205 | 23.146 |
| 2.981070914 | 20.71 |
| nan | 20.71 |
| 5.585452759 | 14.547 |
| 5.862902244 | 15.87 |
| 4.60658323 | 15.208 |
| nan | 15.87 |
| nan | 17.853 |
| 5.492452121 | 16.531 |
| nan | 15.87 |
| nan | 19.176 |
| 6.614454792 | 15.87 |
| 6.622066744 | 15.208 |
| 8.580747755 | 19.176 |
| 5.314310248 | 17.853 |
| 2.512284008 | 14.547 |
| 6.645392633 | 19.176 |
| 6.694719902 | 16.531 |
| 7.488596314 | 17.853 |
| 3.223314711 | 17.192 |
| 10.62773465 | 22.482 |
| 8.445297503 | 20.498 |
| 6.47349252 | 17.192 |
| 4.658241539 | 17.192 |
| 3.357333335 | 12.563 |
| 6.75724217 | 20.498 |
| 2.16720653 | 13.886 |
| 3.727322961 | 11.902 |
| 10.28224704 | 21.488 |
| 6.016863677 | 20.145 |
| 6.337122068 | 16.116 |
| 5.69610882 | 14.102 |
| 7.104024927 | 18.131 |
| 10.02584361 | 21.488 |
| nan | 18.131 |
| nan | 20.817 |
| 3.886749847 | 13.162 |
| 5.277246723 | 13.162 |
| 5.692374236 | 20.474 |
| 6.336349241 | 16.086 |
| 16.77388778 | 24.861 |
| 5.4773174 | 16.086 |
| 20.99545073 | 33.635 |
| 31.56266324 | 31.442 |
| 42.8514405 | 43.141 |
| 18.53114862 | 30.71 |
| 27.26302177 | 38.022 |
| 6.092309358 | 11.699 |
| 8.549716705 | 21.205 |
| nan | 18.882 |
| 6.515469336 | 18.28 |
| 4.816752927 | 15.355 |
| 4.09994288 | 15.355 |
| nan | 17.055 |
| 1.717529232 | 19.096 |
| 2.200444021 | 14.852 |
| 2.114365942 | 16.974 |
| 16.17244695 | 21.924 |
| 0.857794002 | 15.559 |
| 3.619426498 | 16.974 |
| 7.841775523 | 29.704 |
| 65.89490456 | 47.385 |
| 33.37437784 | 28.997 |
| 8.097229752 | 19.856 |
| 1.197322174 | 14.379 |
| 13.20402113 | 19.856 |
| 13.26348633 | 21.226 |
| 6.428621514 | 19.856 |
| 11.34697253 | 24.649 |
| 10.88809907 | 21.91 |
| 17.92583467 | 35.604 |
| nan | 25.631 |
| 14.66339732 | 36.974 |
| 11.7108866 | 29.442 |
| 10.30053405 | 26.018 |
| 4.773155086 | 17.802 |
| 7.997971912 | 17.802 |
| 8.217692888 | 19.172 |
| 24.04547838 | 38.343 |
| 4.157317533 | 15.063 |
| 9.044587903 | 22.595 |
| 12.35036906 | 22.595 |
| 19.30894494 | 28.757 |
| 36.62224468 | 50.668 |
| 7.060140873 | 16.433 |
| 22.62180092 | 41.767 |
| 9.882270382 | 17.117 |
| 7.379404697 | 16.433 |
| nan | 33.379 |
| 18.23126247 | 15.063 |
| 1.354436011 | 14.379 |
| 24.23242111 | 26.018 |
| 14.66909415 | 23.964 |
| 15.57083656 | 23.964 |
| 16.82795097 | 35.604 |
| 26.86393406 | 38.343 |
| 29.03411327 | 46.559 |
| nan | 40.532 |
| 44.58228075 | 40.397 |
| 5.591366312 | 17.802 |
| 12.27970491 | 23.964 |
| 38.30619986 | 44.505 |
| 4.328210506 | 15.063 |
| 6.682071294 | 15.063 |
| 15.23835926 | 21.91 |
| 40.60979781 | 40.397 |
| 42.54102909 | 39.028 |
| 42.9686013 | 42.451 |
| 67.46336801 | 53.406 |
| 56.39284149 | 53.406 |
| 27.68748843 | 35.604 |
| 12.54327647 | 28.757 |
| 5.832853044 | 15.063 |
| 5.63251705 | 15.063 |
| 3.470376797 | 19.172 |
| 8.31930333 | 21.226 |
| 41.31780098 | 35.604 |
| 50.96875621 | 44.505 |
| 45.87610897 | 45.19 |
| 40.22580648 | 43.136 |
| 4.711626502 | 19.856 |
| 40.66671958 | 34.92 |
| nan | 30.399 |
| 7.762489477 | 22.595 |
| 37.45393093 | 36.974 |
| 9.714451788 | 16.433 |
| 49.40021238 | 41.767 |
| 64.44155557 | 45.19 |
| 68.17993936 | 57.515 |
| 6.653003877 | 20.541 |
| 70.60444173 | 65.731 |
| 57.50059139 | 60.938 |
| 4.61042227 | 15.748 |
| 32.35690192 | 30.811 |
| 35.58661425 | 36.974 |
| 42.83812085 | 41.767 |
| 30.32157103 | 29.442 |
| 3.274353161 | 14.379 |
| 13.28288832 | 20.541 |
| nan | 26.227 |
| 8.677995283 | 18.487 |
| 5.092669833 | 13.694 |
| 23.36582308 | 29.442 |
| 10.18224295 | 19.474 |
| 9.879052244 | 22.16 |
| 23.75310142 | 20.817 |
| 20.55924492 | 25.518 |
| 4.9553415 | 10.744 |
| 33.39962124 | 27.816 |
| 2.973203595 | 17.118 |
| 3.506079317 | 12.125 |
| 2.356916353 | 10.698 |
| 5.291563805 | 14.265 |
| 28.81325147 | 37.801 |
| 53.04771784 | 45.647 |
| 46.87800128 | 37.088 |
| 7.115112944 | 14.978 |
| nan | 17.831 |
| 5.229437548 | 17.831 |
| 3.388683885 | 12.838 |
| nan | 23.537 |
| 58.52086688 | 38.514 |
| 48.28426931 | 34.235 |
| 30.04267157 | 49.926 |
| 9.984568791 | 24.963 |
| 2.066075958 | 10.901 |
| 13.5974646 | 22.11 |
| 3.080736924 | 12.945 |
| 2.911303024 | 12.945 |
| 6.018735103 | 14.989 |
| 18.50460097 | 18.544 |
| 59.94260571 | 42.081 |
| 13.93165416 | 19.97 |
| 7.423794974 | 8.857 |
| 4.019830453 | 14.308 |
| 2.594032333 | 11.583 |
| 4.350176512 | 14.989 |
| 3.265360392 | 11.583 |
| 9.129172255 | 14.989 |
| nan | 11.583 |
| 12.63362467 | 17.033 |
| nan | 11.583 |
| 42.63697341 | 40.88 |
| 13.74485479 | 25.209 |
| 37.2448571 | 25.209 |
| nan | 14.308 |
| 38.40510396 | 34.748 |
| 18.98308878 | 27.934 |
| 28.04536337 | 38.836 |
| 5.443204355 | 14.989 |
| 1.875554391 | 12.264 |
| 1.631932971 | 10.901 |
| 46.47507838 | 38.154 |
| 3.558411392 | 13.627 |
| 6.265863497 | 19.077 |
| 2.653953779 | 14.308 |
| 1.512311765 | 12.264 |
| 12.11849994 | 17.714 |
| nan | 38.154 |
| 43.24829429 | 32.704 |
| 51.93720039 | 42.242 |
| 56.38530572 | 59.957 |
| nan | 36.11 |
| 1.674394003 | 14.989 |
| 33.57870681 | 33.385 |
| 3.404476785 | 13.627 |
| 2.145560783 | 12.264 |
| 2.989749002 | 14.308 |
| 2.328915136 | 8.857 |
| 16.38085907 | 18.396 |
| 21.21518013 | 25.209 |
| 28.9471366 | 34.066 |
| 10.38512981 | 20.44 |
| nan | 34.066 |
| 5.438848758 | 19.077 |
| 4.13743478 | 17.714 |
| 2.022702488 | 8.857 |
| 36.67306875 | 23.846 |
| 33.55416468 | 23.165 |
| 6.40729628 | 21.121 |
| 3.978470694 | 14.308 |
| nan | 25.89 |
| 51.81511235 | 42.242 |
| 2.22153835 | 12.264 |
| 2.625458715 | 11.583 |
| 4.351819509 | 12.264 |
| 5.541363474 | 18.396 |
| 48.30449701 | 36.11 |
| 17.98642767 | 22.484 |
| 38.77518226 | 32.704 |
| 2.576975688 | 14.989 |
| 4.117155295 | 14.308 |
| 0.901239414 | 13.783 |
| 40.62590475 | 42.924 |
| 4.696877948 | 21.802 |
| 55.4350079 | 37.69 |
| 37.47710565 | 36.841 |
| 62.50450156 | 38.746 |
| 3.527639771 | 12.704 |
| 74.18187766 | 47.639 |
| 2.631081791 | 15.88 |
| 26.71758989 | 36.841 |
| 1.638577741 | 12.704 |
| 7.08907058 | 11.433 |
| 1.338780633 | 10.163 |
| 7.654086397 | 17.785 |
| 3.986442362 | 13.339 |
| 9.350041788 | 17.15 |
| 66.42347021 | 41.287 |
| 54.51813787 | 44.463 |
| 39.53531098 | 34.3 |
| 2.675803018 | 8.893 |
| 2.869386564 | 13.974 |
| 2.5700604 | 15.245 |
| 1.390610877 | 11.433 |
| 4.674692653 | 15.88 |
| 39.68762052 | 35.571 |
| 11.42162529 | 17.785 |
| 2.208915609 | 12.704 |
| 50.92249487 | 29.854 |
| 3.156224483 | 8.893 |
| nan | 27.948 |
| 10.93806865 | 14.609 |
| 24.05662179 | 19.691 |
| nan | 33.665 |
| 3.661085573 | 12.704 |
| 3.221649895 | 17.785 |
| 3.006016448 | 13.974 |
| 10.34305061 | 15.245 |
| 10.96163679 | 17.005 |
| 21.56436814 | 26.924 |
| 6.998232358 | 19.056 |
| 34.10009136 | 37.552 |
| 5.451917123 | 19.056 |
| 3.325367468 | 10.628 |
| 23.02504384 | 32.592 |
| 10.31520005 | 21.256 |
| 2.906720208 | 12.045 |
| 2.936588738 | 14.879 |
| 9.064213621 | 17.785 |
| 2.316378659 | 14.17 |
| 3.268913567 | 14.879 |
| 51.69952992 | 48.179 |
| nan | 50.305 |
| nan | 46.762 |
| 19.63905264 | 37.552 |
| 6.65616832 | 17.005 |
| 3.927520664 | 14.17 |
| 42.91267862 | 35.707 |
| 4.291125735 | 13.462 |
| 3.896552794 | 13.462 |
| 43.19133177 | 48.179 |
| 59.02063137 | 55.265 |
| 47.83086982 | 43.928 |
| 25.6541373 | 21.964 |
| 6.900249927 | 23.381 |
| 61.87195848 | 56.682 |
| 4.47910023 | 17.005 |
| 3.889407826 | 14.17 |
| 7.55589112 | 20.547 |
| 71.8238671 | 46.762 |
| nan | 49.596 |
| 84.19295531 | 59.516 |
| 76.15004891 | 43.22 |
| 13.27303221 | 23.381 |
| 3.968078123 | 14.17 |
| 4.40057058 | 21.964 |
| 15.77910279 | 22.673 |
| 102.9520107 | 43.928 |
| 81.40096846 | 54.556 |
| 80.9682865 | 48.179 |
| 16.81012739 | 31.175 |
| 3.786131155 | 11.336 |
| 4.594050118 | 16.296 |
| 51.6979855 | 42.319 |
| 72.15117149 | 46.054 |
| 17.6915881 | 26.215 |
| nan | 13.462 |
| 4.675888135 | 14.17 |
| 13.44043514 | 24.798 |
| 41.89102012 | 33.3 |
| 75.68429952 | 52.431 |
| 88.46562639 | 41.094 |
| 8.534229983 | 17.713 |
| 8.514368038 | 20.547 |
| 6.103755923 | 15.587 |
| nan | 12.753 |
| 83.30320592 | 49.606 |
| 49.81017325 | 36.695 |
| 66.53821448 | 62.517 |
| 75.28244365 | 62.517 |
| 47.46533548 | 46.208 |
| 28.64161413 | 31.258 |
| 18.46177099 | 25.822 |
| 5.645590306 | 16.309 |
| 55.69982226 | 59.022 |
| 5.286695658 | 16.309 |
| 58.01508716 | 50.965 |
| nan | 69.515 |
| nan | 62.957 |
| 23.80008997 | 33.976 |
| 10.94058332 | 25.822 |
| 12.73917441 | 19.027 |
| 83.24594872 | 58.439 |
| 7.844887168 | 20.869 |
| 9.335314611 | 17.503 |
| 32.68128806 | 34.333 |
| 74.68108142 | 52.324 |
| 25.58859212 | 36.052 |
| 11.01198858 | 21.745 |
| 7.112946885 | 17.359 |
| 20.79902552 | 27.373 |
| nan | 45.906 |
| nan | 40.659 |
| 31.13633935 | 47.402 |
| 38.51861289 | 44.169 |
| 8.189424571 | 19.706 |
| 90.18720179 | 46.887 |
| 9.161751061 | 20.697 |
| nan | 53.12 |
| 50.69549903 | 47.402 |
| 3.356388829 | 13.353 |
| 5.492945786 | 15.356 |
| 23.56449445 | 29.376 |
| 29.34123807 | 30.711 |
| 83.24864958 | 55.414 |
| nan | 43.938 |
| 41.23259433 | 46.735 |
| 7.085481077 | 16.691 |
| 67.41454747 | 56.749 |
| 46.06638426 | 50.073 |
| nan | 35.413 |
| 4.569930806 | 16.023 |
| 5.470911005 | 14.02 |
| 4.757208912 | 12.685 |
| 7.526965518 | 16.691 |
| 5.961558053 | 18.694 |
| 56.79831959 | 38.723 |
| 74.96015147 | 53.411 |
| 43.54464531 | 46.067 |
| 18.4099969 | 24.703 |
| 4.101689295 | 10.015 |
| 15.95828008 | 20.697 |
| nan | 30.822 |
| 2.918191512 | 10.015 |
| 2.969251117 | 14.688 |
| 1.096012876 | 15.083 |
| 3.764435942 | 11.35 |
| nan | 20.33 |
| 9.346494424 | 21.364 |
| 35.42019281 | 36.052 |
| 27.16874559 | 28.855 |
| 39.00318129 | 35.385 |
| nan | 28.855 |
| 1.717518408 | 12.017 |
| 12.5357549 | 20.029 |
| 3.124422641 | 14.688 |
| 2.701499508 | 14.688 |
| 2.828217042 | 12.017 |
| 2.807491944 | 13.353 |
| 3.715154974 | 10.682 |
| 13.17560946 | 20.697 |
| 5.606250294 | 16.691 |
| 5.399610282 | 14.02 |
| 6.320449221 | 12.017 |
| 3.742228423 | 11.35 |
| 5.081762638 | 14.02 |
| 2.660285458 | 13.353 |
| 3.347073352 | 12.685 |
| 5.52677815 | 15.356 |
| 10.63690353 | 21.364 |
| 2.642618286 | 9.347 |
| 8.240713992 | 22.584 |
| 9.045335632 | 17.109 |
| 9.66694528 | 15.056 |
| 42.49760098 | 35.587 |
| 16.09961093 | 25.321 |
| 10.75319352 | 20.531 |
| 9.783693002 | 21.488 |
| 3.085221067 | 20.51 |
| 1.351668736 | 21.217 |
| 6.691796345 | 21.924 |
| 5.128116555 | 24.753 |
| 4.121524247 | 25.461 |
| 5.874696809 | 21.924 |
| 2.434200282 | 15.559 |
| 2.742989809 | 15.739 |
| 2.981548089 | 21.217 |
| 0.847155352 | 22.632 |
| nan | 12.73 |
| 0.859586798 | 15.559 |
| 1.627062935 | 14.852 |
| 2.346104448 | 19.803 |
| 1.543440832 | 19.096 |
| nan | 15.559 |
| 2.163530033 | 19.096 |
| 1.774842998 | 17.681 |
| nan | 20.51 |
| nan | 22.632 |
| 5.458876938 | 20.51 |
| 4.754129994 | 19.803 |
| 4.305320468 | 21.217 |
| 4.310525135 | 23.339 |
| 7.286854691 | 23.339 |
| 2.082332342 | 12.73 |
| 1.357264067 | 20.51 |
| 7.248913677 | 26.168 |
| 2.263016603 | 28.29 |
| 2.431603565 | 18.388 |
| 2.202599785 | 18.388 |
| 1.769847617 | 15.559 |
| 1.725387926 | 21.924 |
| 3.810766458 | 26.875 |
| 7.543106482 | 22.632 |
| 9.814121288 | 31.826 |
| 2.548564503 | 19.803 |
| nan | 17.681 |
| nan | 36.069 |
| 3.48339232 | 16.974 |
| 3.266262761 | 18.388 |
| nan | 21.217 |
| nan | 33.24 |
| 12.37317931 | 33.948 |
| 10.00630487 | 28.997 |
| 3.69960837 | 24.046 |
| 3.917348752 | 14.145 |
| 2.119892555 | 21.924 |
| 1.313136727 | 13.438 |
| 5.677392502 | 18.388 |
| 4.691257465 | 23.339 |
| 4.050014388 | 19.803 |
| 3.661715953 | 20.51 |
| 2.36719825 | 20.51 |
| 2.46844333 | 19.096 |
| 4.364375552 | 21.924 |
| 14.51618498 | 31.826 |
| 10.73043883 | 23.339 |
| 2.184393988 | 15.559 |
| 2.760123385 | 12.023 |
| 2.458610653 | 16.267 |
| 1.535762318 | 16.267 |
| 35.70151754 | 35.362 |
| 9.507972089 | 16.69 |
| 4.708830773 | 14.305 |
| 5.141118644 | 10.729 |
| 20.03511808 | 22.65 |
| nan | 21.458 |
| 45.72365352 | 29.803 |
| 6.012901709 | 11.325 |
| 15.00392773 | 22.054 |
| 2.852125177 | 18.478 |
| 4.713411856 | 17.882 |
| 54.37902184 | 32.783 |
| 7.573340073 | 16.094 |
| 6.591909656 | 17.802 |
| 5.466826598 | 19.172 |
| 5.844377489 | 12.325 |
| 4.860625867 | 19.172 |
| 5.828136758 | 18.487 |
| 7.70543227 | 14.379 |
| 6.771734408 | 14.379 |
| 5.904100659 | 15.063 |
| 6.625145132 | 14.379 |
| 19.98600463 | 28.611 |
| 9.316447847 | 20.862 |
| 6.427224173 | 13.694 |
| 7.689779768 | 14.305 |
| 32.04659498 | 37.552 |
| 7.291304871 | 16.69 |
| 6.434123726 | 17.882 |
| 7.285552823 | 14.901 |
| 7.369223895 | 16.69 |
| 4.12220227 | 14.901 |
| 5.200780621 | 16.094 |
| 4.510531518 | 15.498 |
| 10.65404144 | 17.882 |
| 26.90511919 | 33.975 |
| 2.71262263 | 10.133 |
| 3.132508479 | 13.709 |
| 4.167011089 | 9.537 |
| 22.60973824 | 20.862 |
| nan | 38.744 |
| 6.223464973 | 16.094 |
| 2.853425391 | 14.372 |
| 11.06255385 | 16.83 |
| nan | 21.9 |
| nan | 24.637 |
| 13.68639102 | 21.215 |
| 9.789424259 | 23.953 |
| 8.895681092 | 23.953 |
| 7.581481609 | 17.793 |
| 5.508991629 | 19.162 |
| 1.847808635 | 15.74 |
| 5.566404761 | 11.444 |
| 14.67686281 | 20.531 |
| 6.006717635 | 17.882 |
| 13.70781249 | 19.67 |
| 17.70540888 | 25.631 |
| nan | 25.034 |
| 12.81011617 | 27.419 |
| 3.153329256 | 13.113 |
| 3.53366053 | 15.498 |
| 4.818120302 | 12.517 |
| 4.563833706 | 13.113 |
| 4.680671279 | 12.517 |
| 4.044848292 | 10.133 |
| 6.677589333 | 17.286 |
| 6.284097136 | 14.305 |
| 1.55670163 | 10.133 |
| 31.17877 | 25.631 |
| 28.72138445 | 20.862 |
| 20.55193455 | 25.034 |
| 14.96221589 | 23.246 |
| 3.839105324 | 12.517 |
| 5.354009774 | 11.325 |
| 3.834619474 | 11.325 |
| 7.024203056 | 14.305 |
| 2.881298233 | 16.396 |
| 4.624608618 | 19.96 |
| 6.629053964 | 19.247 |
| 5.867588785 | 17.821 |
| 13.61781558 | 30.653 |
| 19.49934365 | 29.227 |
| 5.156683792 | 14.97 |
| 1.77025848 | 22.098 |
| 16.18027733 | 31.366 |
| nan | 32.078 |
| 5.738812564 | 16.396 |
| 1.285327608 | 14.257 |
| 3.988830789 | 17.108 |
| 5.038071038 | 23.524 |
| 18.73416097 | 32.791 |
| 3.233490089 | 17.108 |
| 5.521403976 | 22.811 |
| nan | 27.801 |
| 2.439515729 | 18.534 |
| 3.697180397 | 17.108 |
| 3.58654135 | 12.831 |
| 10.2964166 | 19.247 |
| 17.14745143 | 29.227 |
| 20.19080302 | 32.078 |
| 10.99299645 | 26.376 |
| 7.921815468 | 20.673 |
| 2.482742109 | 13.783 |
| 45.53203454 | 38.067 |
| 29.13405686 | 28.222 |
| 7.848751844 | 16.408 |
| 2.623921523 | 16.408 |
| nan | 12.47 |
| nan | 15.752 |
| 4.23553025 | 15.095 |
| 52.48119622 | 40.692 |
| 56.73888581 | 42.005 |
| 37.32353671 | 33.472 |
| 28.6059677 | 32.16 |
| 9.734758026 | 15.095 |
| 6.960007191 | 18.377 |
| 2.558539205 | 14.439 |
| 2.578286503 | 15.752 |
| 2.498603608 | 14.439 |
| 4.333259185 | 13.126 |
| 61.77969326 | 36.098 |
| 3.33223982 | 16.408 |
| nan | 13.783 |
| nan | 9.845 |
| 3.570274582 | 10.501 |
| 8.454586873 | 18.377 |
| 48.20718751 | 29.535 |
| 36.63706679 | 32.16 |
| 20.11677078 | 25.597 |
| 8.055463174 | 16.408 |
| 3.047236208 | 14.439 |
| 42.43127271 | 38.067 |
| 2.514249082 | 13.126 |
| 47.37902278 | 41.348 |
| 13.93088657 | 20.346 |
| 11.36291468 | 19.69 |
| 23.29993784 | 25.597 |
| 6.326526152 | 15.095 |
| 4.49631565 | 19.033 |
| 2.459504573 | 13.126 |
| 2.601856856 | 13.783 |
| 32.10890611 | 33.472 |
| 20.46386372 | 24.908 |
| 6.414270303 | 20.196 |
| nan | 19.69 |
| 2.359889302 | 12.47 |
| 1.997342348 | 13.783 |
| 6.622557135 | 20.346 |
| nan | 21.659 |
| 12.30986897 | 20.346 |
| 56.83158587 | 35.441 |
| 38.09283706 | 34.129 |
| 46.5431038 | 40.036 |
| 2.257228767 | 15.095 |
| 42.94840372 | 33.472 |
| 14.58718632 | 22.315 |
| 3.665019115 | 17.721 |
| 2.819634553 | 12.47 |
| 2.526540615 | 14.439 |
| 2.089396453 | 12.47 |
| 2.725030285 | 15.752 |
| 2.74507177 | 16.408 |
| 52.63267551 | 38.723 |
| 2.659457752 | 16.408 |
| 2.359409762 | 15.752 |
| 1.536381452 | 14.439 |
| 46.12146235 | 37.41 |
| 16.63357164 | 25.597 |
| 41.21266842 | 36.368 |
| 7.109872741 | 17.064 |
| 2.367299902 | 9.49 |
| 1.928968971 | 10.123 |
| 1.86532208 | 12.653 |
| nan | 32.16 |
| nan | 29.535 |
| 26.64024684 | 29.535 |
| 11.71750531 | 17.064 |
| 10.22333322 | 18.377 |
| 9.84532653 | 17.064 |
| 2.411900871 | 14.551 |
| 1.765825759 | 13.918 |
| 47.57180053 | 40.49 |
| 54.48529882 | 40.49 |
| 52.18500542 | 34.796 |
| 55.86582967 | 39.857 |
| 48.59548982 | 38.592 |
| 25.03509387 | 28.47 |
| 3.206961152 | 10.755 |
| 0.968314 | 10.123 |
| 1.403648862 | 13.286 |
| 23.39154492 | 32.898 |
| 4.855254609 | 17.714 |
| 3.928929765 | 16.449 |
| 32.19935076 | 33.531 |
| 50.7293836 | 34.163 |
| 37.55230556 | 33.531 |
| nan | 17.082 |
| nan | 20.245 |
| 4.384675352 | 12.653 |
| 4.03858808 | 12.017 |
| 2.057927074 | 16.023 |
| 3.739061294 | 10.015 |
| 4.812431503 | 16.023 |
| 5.887215841 | 12.685 |
| nan | 19.018 |
| 2.608165114 | 16.691 |
| 4.952373721 | 18.026 |
| 16.95190963 | 22.032 |
| 80.69765138 | 54.079 |
| 72.36259603 | 53.411 |
| 16.58222303 | 26.705 |
| 38.56263002 | 34.049 |
| nan | 14.428 |
| 3.00441968 | 16.023 |
| 37.26345627 | 42.729 |
| 75.4500041 | 53.411 |
| 16.68307191 | 22.7 |
| nan | 24.265 |
| 6.218626038 | 17.359 |
| 2.985797611 | 12.017 |
| 4.155592502 | 13.353 |
| 50.70865853 | 40.726 |
| 3.614533311 | 16.023 |
| 98.83198843 | 52.743 |
| 2.656050011 | 11.35 |
| 5.175415523 | 16.691 |
| 2.241332582 | 10.015 |
| nan | 24.92 |
| 64.46158749 | 45.399 |
| 28.33771865 | 30.711 |
| 17.54636188 | 23.367 |
| 4.481313053 | 16.691 |
| 3.329231147 | 11.35 |
| nan | 17.051 |
| 3.861936 | 18.026 |
| nan | 19.674 |
| 44.22870456 | 44.064 |
| nan | 22.297 |
| 50.20760262 | 42.729 |
| nan | 22.297 |
| 3.776266365 | 11.35 |
| 3.523353641 | 11.35 |
| 3.767157315 | 13.353 |
| 1.002322132 | 7.344 |
| 12.62170423 | 22.7 |
| 4.699960202 | 14.02 |
| 51.07990049 | 45.104 |
| 58.35626886 | 36.352 |
| 82.29660312 | 52.509 |
| 4.413648314 | 12.017 |
| 3.964342588 | 18.694 |
| 46.57803745 | 40.058 |
| 32.4846404 | 31.379 |
| nan | 31.478 |
| 7.282129176 | 15.356 |
| 30.19004323 | 37.388 |
| 30.38088547 | 23.367 |
| 2.981376217 | 6.676 |
| 3.237019168 | 16.691 |
| nan | 29.511 |
| 6.405242835 | 15.356 |
| 75.9445464 | 51.408 |
| 98.74423449 | 54.746 |
| 65.4193785 | 45.399 |
| 72.52858575 | 41.393 |
| 19.11457129 | 22.7 |
| 3.590872835 | 14.688 |
| 4.866231191 | 14.02 |
| nan | 42.627 |
| 2.523124671 | 12.685 |
| 3.837912245 | 14.688 |
| nan | 44.594 |
| 79.2014285 | 47.402 |
| 91.32054017 | 62.758 |
| 67.46846131 | 47.402 |
| 46.04915643 | 40.058 |
| 18.6912806 | 23.367 |
| 4.673769079 | 15.74 |
| nan | 42.431 |
| 4.460215947 | 16.425 |
| 7.814850289 | 21.9 |
| 55.94100189 | 37.64 |
| nan | 33.534 |
| 9.290542574 | 17.793 |
| 9.372433574 | 17.109 |
| 87.76490608 | 35.587 |
| 42.25686596 | 43.396 |
| 14.60293912 | 21.364 |
| nan | 19.674 |
| nan | 21.641 |
| 15.5470139 | 23.367 |
| 5.55150798 | 16.023 |
| 11.45676853 | 21.364 |
| 52.87359744 | 40.058 |
| 82.90251137 | 59.42 |
| 2.682387676 | 14.688 |
| 98.85866924 | 45.25 |
| 67.88186987 | 53.12 |
| 59.14393657 | 45.906 |
| 14.54532119 | 25.576 |
| 80.33908084 | 59.678 |
| 36.9378769 | 36.069 |
| 19.44637527 | 17.707 |
| 7.421833312 | 20.33 |
| 57.29831186 | 46.562 |
| 3.16162167 | 17.051 |
| 68.47748234 | 41.738 |
| 65.16361014 | 35.679 |
| 84.92494836 | 53.182 |
| nan | 52.509 |
| 7.730486518 | 19.522 |
| 4.358055683 | 19.018 |
| 2.476628142 | 17.051 |
| 8.276870941 | 20.986 |
| 4.974112408 | 15.083 |
| 41.79316418 | 36.069 |
| 87.67463638 | 51.808 |
| 28.04405808 | 32.79 |
| 49.36041259 | 40.004 |
| 47.86575522 | 41.315 |
| 41.25432925 | 38.036 |
| 2.967737702 | 18.362 |
| 16.22801166 | 26.888 |
| 47.91951868 | 36.725 |
| 64.58335212 | 41.971 |
| 3.610523036 | 22.297 |
| 21.11546658 | 30.822 |
| nan | 32.533 |
| nan | 34.655 |
| 15.99292075 | 26.232 |
| 5.075952839 | 14.428 |
| 37.12210849 | 38.692 |
| 40.65722624 | 48.529 |
| 1.98443575 | 16.395 |
| 9.561493912 | 18.362 |
| 15.79723138 | 28.199 |
| nan | 43.849 |
| nan | 38.191 |
| 36.36701638 | 47.217 |
| 5.610341044 | 21.641 |
| 25.13636639 | 34.757 |
| 30.97730547 | 34.757 |
| 11.4469376 | 21.641 |
| 2.872816277 | 16.395 |
| 53.78551295 | 47.217 |
| 18.51669536 | 30.167 |
| 95.80082834 | 48.529 |
| 5.15549823 | 17.707 |
| 4.93591923 | 20.33 |
| 6.380985714 | 17.707 |
| 2.317561952 | 15.739 |
| 1.864104377 | 13.116 |
| 49.0445185 | 45.25 |
| 4.93964635 | 17.707 |
| 28.0379607 | 31.478 |
| 2.372355535 | 15.739 |
| 2.071900241 | 14.428 |
| 2.797283668 | 17.707 |
| nan | 21.217 |
| nan | 21.217 |
| 2.458430641 | 13.116 |
| 5.176418677 | 16.395 |
| nan | 38.191 |
| 8.660834741 | 28.199 |
| 18.95272282 | 26.232 |
| 25.24829974 | 28.855 |
| 27.7366104 | 31.478 |
| 5.838470247 | 20.986 |
| nan | 34.655 |
| 2.408606314 | 15.083 |
| 3.968744006 | 19.018 |
| 2.521080982 | 14.428 |
| 77.56708703 | 41.971 |
| nan | 24.753 |
| nan | 19.096 |
| 3.16568628 | 15.739 |
| 3.358801582 | 13.772 |
| 4.435951003 | 13.772 |
| 22.15341272 | 34.101 |
| 33.1119601 | 39.348 |
| nan | 50.214 |
| nan | 49.507 |
| 5.172447877 | 15.083 |
| 2.912541082 | 18.442 |
| nan | 16.665 |
| 4.622706962 | 16.665 |
| 4.843274679 | 12.12 |
| 12.05243077 | 18.938 |
| 7.055352759 | 21.21 |
| 3.535960703 | 17.423 |
| 2.940019526 | 17.423 |
| 2.559988417 | 15.15 |
| 3.896334141 | 19.695 |
| 3.467519444 | 12.12 |
| 3.003544056 | 20.453 |
| 3.020361521 | 20.453 |
| 4.012995544 | 17.423 |
| 3.979378882 | 14.393 |
| 3.552331608 | 17.423 |
| 4.470901038 | 19.695 |
| 45.1977137 | 49.995 |
| 35.26089139 | 49.995 |
| 4.796264909 | 18.18 |
| 3.576597083 | 18.18 |
| 2.929150091 | 12.878 |
| 44.67079743 | 54.54 |
| 1.539976053 | 12.685 |
| 2.738313536 | 13.32 |
| 1.777565302 | 12.051 |
| 3.920216088 | 14.588 |
| nan | 14.393 |
| 11.65160215 | 21.21 |
| 6.868061661 | 12.685 |
| 5.95149365 | 18.18 |
| 5.503887445 | 15.15 |
| 6.41413643 | 12.12 |
| 5.975944824 | 15.908 |
| 4.074798368 | 10.783 |
| 2.687943832 | 14.588 |
| 4.313680086 | 13.32 |
| 5.009348811 | 12.685 |
| 2.024365127 | 12.051 |
| 7.575123452 | 11.417 |
| 8.910317409 | 15.222 |
| 4.702089138 | 13.954 |
| 4.071786545 | 13.954 |
| 4.41643645 | 16.491 |
| 3.827896524 | 10.783 |
| 4.897949938 | 9.514 |
| 4.711205685 | 10.783 |
| 1.594773662 | 10.783 |
| 7.836528461 | 19.662 |
| 6.879947365 | 17.503 |
| 5.092406889 | 17.503 |
| 49.17893051 | 36.352 |
| 8.942464471 | 12.117 |
| 4.980659371 | 18.176 |
| 9.949600555 | 15.483 |
| 4.702352526 | 17.503 |
| 7.346882359 | 13.32 |
| 3.329577395 | 10.148 |
| 3.90241237 | 16.491 |
| 6.247262356 | 13.954 |
| 9.529594073 | 19.028 |
| nan | 11.417 |
| 11.0153615 | 17.76 |
| 4.3376399 | 13.954 |
| 4.615277794 | 13.32 |
| 3.801617429 | 17.125 |
| nan | 10.148 |
| 5.232049841 | 12.051 |
| 1.327239568 | 10.148 |
| 9.120196991 | 14.588 |
| 4.422677364 | 9.514 |
| 5.075114288 | 11.417 |
| 4.875761009 | 15.222 |
| 6.597709059 | 17.125 |
| 11.69419179 | 20.297 |
| 18.02303343 | 23.468 |
| nan | 27.908 |
| 7.252187042 | 14.588 |
| 3.716687239 | 11.417 |
| 2.965814594 | 8.88 |
| 28.52947187 | 23.468 |
| nan | 29.811 |
| 35.81213258 | 27.274 |
| 5.984046989 | 14.588 |
| 6.11679838 | 11.417 |
| 6.139224077 | 13.32 |
| 6.602264802 | 12.685 |
| 2.802250539 | 17.055 |
| 6.938305933 | 13.32 |
| 19.12951012 | 29.846 |
| 23.65966685 | 23.755 |
| 16.92673315 | 23.146 |
| 14.49738525 | 32.892 |
| 6.590517458 | 20.101 |
| 4.626483811 | 17.125 |
| 5.863628726 | 18.273 |
| 7.36896088 | 17.664 |
| 2.16985935 | 17.055 |
| 4.486732262 | 15.837 |
| 14.02075781 | 33.501 |
| 10.35444292 | 26.801 |
| 7.255755177 | 20.71 |
| 5.505579142 | 19.491 |
| 3.446954882 | 14.009 |
| 1.399986818 | 16.446 |
| 16.21794235 | 25.582 |
| 19.66523724 | 33.501 |
| 32.06401158 | 46.292 |
| 30.16372783 | 39.592 |
| 18.10946312 | 34.719 |
| 15.11515404 | 25.582 |
| 5.298726426 | 19.491 |
| 1.157990676 | 21.319 |
| 45.87430857 | 48.729 |
| 5.226908608 | 17.055 |
| 1.585930795 | 14.009 |
| 28.01549723 | 32.283 |
| 24.86927414 | 34.719 |
| 33.03806416 | 45.683 |
| 13.18312741 | 35.328 |
| 4.451255483 | 17.664 |
| 3.593658783 | 16.446 |
| 2.28549645 | 11.573 |
| 1.27425682 | 16.446 |
| 24.70484561 | 34.11 |
| 51.74757394 | 53.601 |
| nan | 52.383 |
| nan | 52.992 |
| 36.84627307 | 29.846 |
| 26.69279146 | 29.846 |
| 1.153579136 | 17.055 |
| 19.17678733 | 28.628 |
| 22.1628601 | 33.501 |
| 68.19855644 | 46.292 |
| 2.054169773 | 14.009 |
| 0.118877183 | 16.446 |
| 45.70634754 | 44.465 |
| 48.06822912 | 32.892 |
| 6.929808829 | 17.055 |
| 30.93242491 | 34.719 |
| 1.084813812 | 16.446 |
| 2.004262285 | 20.71 |
| 23.56629921 | 25.582 |
| nan | 22.537 |
| 4.230054597 | 15.837 |
| 2.002473076 | 18.273 |
| 6.356404882 | 21.319 |
| nan | 28.628 |
| 18.88971263 | 28.019 |
| 5.547471374 | 21.319 |
| 19.99448737 | 30.455 |
| 20.786354 | 36.883 |
| 0.371088976 | 17.076 |
| 12.00279685 | 27.321 |
| 34.40937571 | 34.834 |
| 64.09616218 | 51.91 |
| 32.52673858 | 42.347 |
| 2.521163255 | 24.589 |
| 3.685879256 | 19.808 |